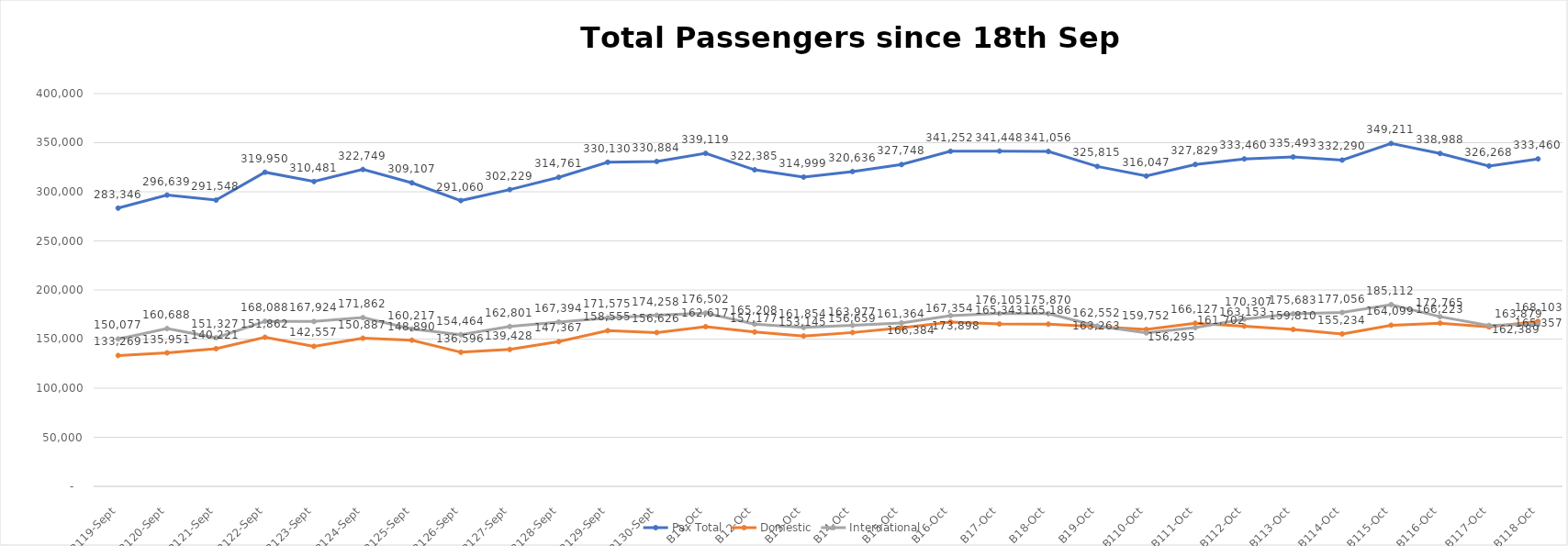
| Category | Pax Total | Domestic | International |
|---|---|---|---|
| 2023-09-19 | 283346 | 133269 | 150077 |
| 2023-09-20 | 296639 | 135951 | 160688 |
| 2023-09-21 | 291548 | 140221 | 151327 |
| 2023-09-22 | 319950 | 151862 | 168088 |
| 2023-09-23 | 310481 | 142557 | 167924 |
| 2023-09-24 | 322749 | 150887 | 171862 |
| 2023-09-25 | 309107 | 148890 | 160217 |
| 2023-09-26 | 291060 | 136596 | 154464 |
| 2023-09-27 | 302229 | 139428 | 162801 |
| 2023-09-28 | 314761 | 147367 | 167394 |
| 2023-09-29 | 330130 | 158555 | 171575 |
| 2023-09-30 | 330884 | 156626 | 174258 |
| 2023-10-01 | 339119 | 162617 | 176502 |
| 2023-10-02 | 322385 | 157177 | 165208 |
| 2023-10-03 | 314999 | 153145 | 161854 |
| 2023-10-04 | 320636 | 156659 | 163977 |
| 2023-10-05 | 327748 | 161364 | 166384 |
| 2023-10-06 | 341252 | 167354 | 173898 |
| 2023-10-07 | 341448 | 165343 | 176105 |
| 2023-10-08 | 341056 | 165186 | 175870 |
| 2023-10-09 | 325815 | 162552 | 163263 |
| 2023-10-10 | 316047 | 159752 | 156295 |
| 2023-10-11 | 327829 | 166127 | 161702 |
| 2023-10-12 | 333460 | 163153 | 170307 |
| 2023-10-13 | 335493 | 159810 | 175683 |
| 2023-10-14 | 332290 | 155234 | 177056 |
| 2023-10-15 | 349211 | 164099 | 185112 |
| 2023-10-16 | 338988 | 166223 | 172765 |
| 2023-10-17 | 326268 | 162389 | 163879 |
| 2023-10-18 | 333460 | 168103 | 165357 |